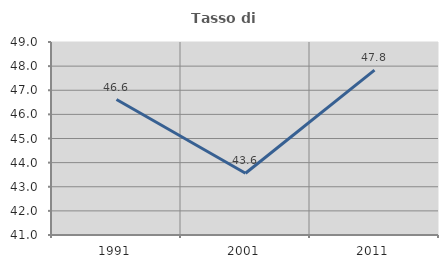
| Category | Tasso di occupazione   |
|---|---|
| 1991.0 | 46.615 |
| 2001.0 | 43.561 |
| 2011.0 | 47.834 |